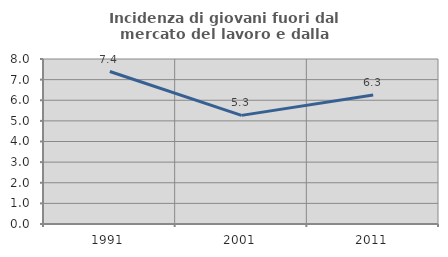
| Category | Incidenza di giovani fuori dal mercato del lavoro e dalla formazione  |
|---|---|
| 1991.0 | 7.394 |
| 2001.0 | 5.267 |
| 2011.0 | 6.25 |